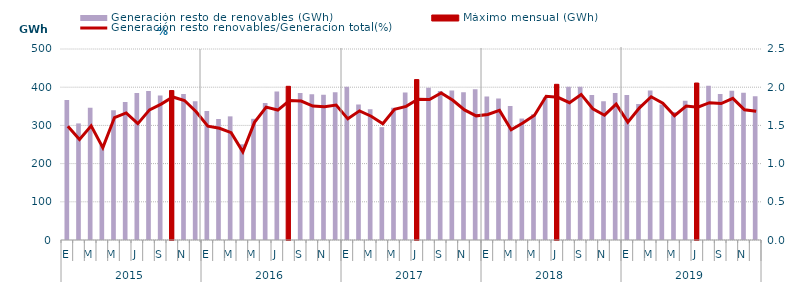
| Category | Generación resto de renovables (GWh) | Máximo mensual (GWh) |
|---|---|---|
| 0 | 366.342 | 0 |
| 1 | 305.191 | 0 |
| 2 | 346.51 | 0 |
| 3 | 249.274 | 0 |
| 4 | 339.962 | 0 |
| 5 | 361.504 | 0 |
| 6 | 385.125 | 0 |
| 7 | 389.73 | 0 |
| 8 | 378.339 | 0 |
| 9 | 391.17 | 391.17 |
| 10 | 382.48 | 0 |
| 11 | 363.223 | 0 |
| 12 | 337.767 | 0 |
| 13 | 316.822 | 0 |
| 14 | 323.67 | 0 |
| 15 | 250.537 | 0 |
| 16 | 317.278 | 0 |
| 17 | 358.69 | 0 |
| 18 | 388.956 | 0 |
| 19 | 402.341 | 402.341 |
| 20 | 384.904 | 0 |
| 21 | 381.279 | 0 |
| 22 | 379.932 | 0 |
| 23 | 386.775 | 0 |
| 24 | 401.263 | 0 |
| 25 | 354.803 | 0 |
| 26 | 342.55 | 0 |
| 27 | 295.467 | 0 |
| 28 | 346.165 | 0 |
| 29 | 386.302 | 0 |
| 30 | 419.869 | 419.869 |
| 31 | 398.846 | 0 |
| 32 | 389.738 | 0 |
| 33 | 391.345 | 0 |
| 34 | 386.468 | 0 |
| 35 | 394.771 | 0 |
| 36 | 375.856 | 0 |
| 37 | 370.492 | 0 |
| 38 | 350.867 | 0 |
| 39 | 317.941 | 0 |
| 40 | 329.126 | 0 |
| 41 | 373.059 | 0 |
| 42 | 407.594 | 407.594 |
| 43 | 401.454 | 0 |
| 44 | 401.026 | 0 |
| 45 | 379.66 | 0 |
| 46 | 363.125 | 0 |
| 47 | 384.971 | 0 |
| 48 | 379.277 | 0 |
| 49 | 355.918 | 0 |
| 50 | 391.364 | 0 |
| 51 | 354.875 | 0 |
| 52 | 335.219 | 0 |
| 53 | 364.42 | 0 |
| 54 | 410.928 | 410.928 |
| 55 | 403.995 | 0 |
| 56 | 381.972 | 0 |
| 57 | 390.393 | 0 |
| 58 | 385.716 | 0 |
| 59 | 376.478 | 0 |